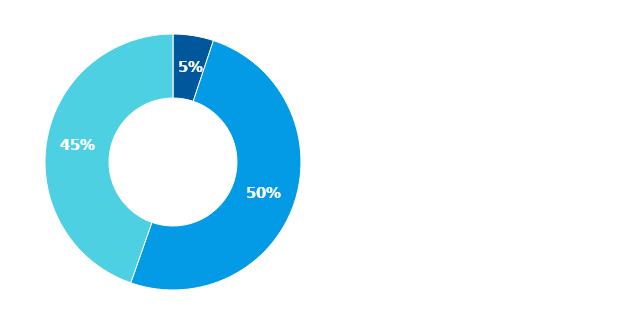
| Category | Series 0 |
|---|---|
| Hotovost | 0.051 |
| Půjčky poskytnuté nemovitostní společnosti | 0.502 |
| Majetkové účasti v nemovitostní společnosti | 0.446 |
| Ostatní finanční aktiva | 0 |